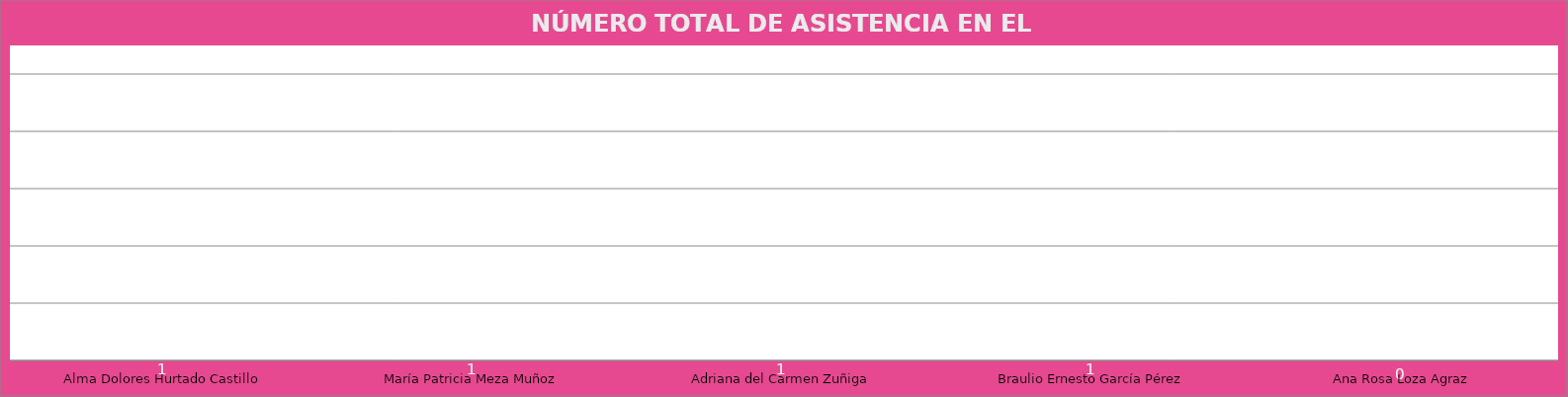
| Category | Alma Dolores Hurtado Castillo |
|---|---|
| Alma Dolores Hurtado Castillo | 1 |
| María Patricia Meza Muñoz | 1 |
| Adriana del Carmen Zuñiga | 1 |
| Braulio Ernesto García Pérez | 1 |
| Ana Rosa Loza Agraz | 0 |